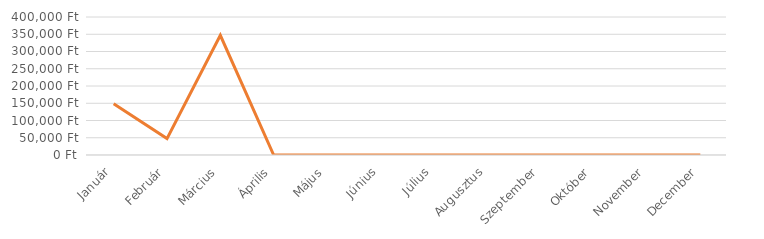
| Category | Series 0 |
|---|---|
| Január | 148340 |
| Február | 47560 |
| Március | 347000 |
| Április | 0 |
| Május | 0 |
| Június | 0 |
| Július | 0 |
| Augusztus | 0 |
| Szeptember | 0 |
| Október | 0 |
| November | 0 |
| December | 0 |